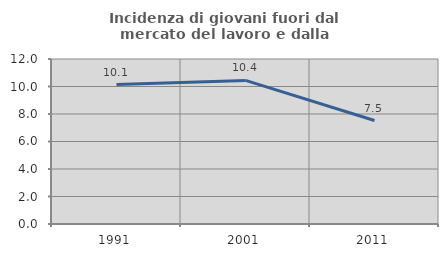
| Category | Incidenza di giovani fuori dal mercato del lavoro e dalla formazione  |
|---|---|
| 1991.0 | 10.143 |
| 2001.0 | 10.442 |
| 2011.0 | 7.527 |